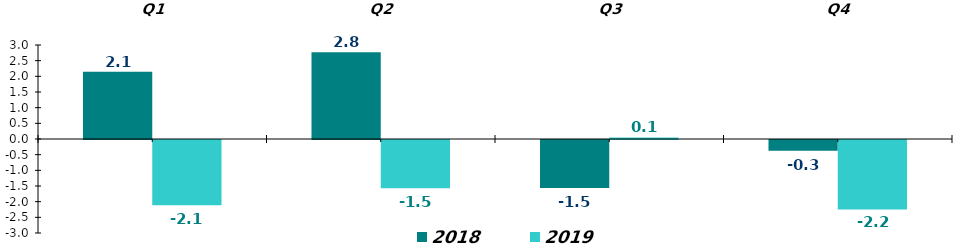
| Category | 2018 | 2019 |
|---|---|---|
| Q1 | 2.145 | -2.084 |
| Q2 | 2.77 | -1.537 |
| Q3 | -1.532 | 0.051 |
| Q4 | -0.341 | -2.217 |